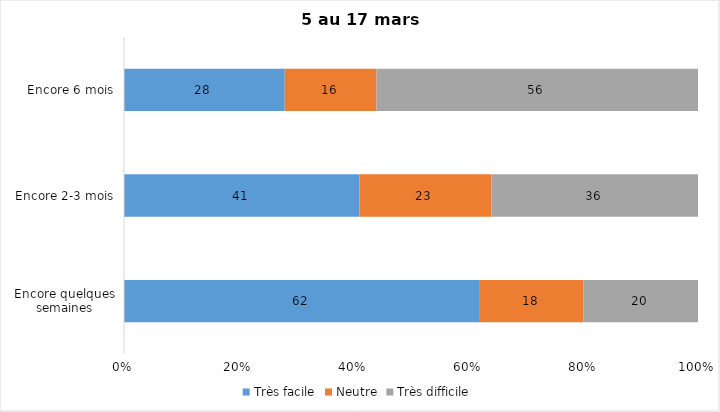
| Category | Très facile | Neutre | Très difficile |
|---|---|---|---|
| Encore quelques semaines | 62 | 18 | 20 |
| Encore 2-3 mois | 41 | 23 | 36 |
| Encore 6 mois | 28 | 16 | 56 |